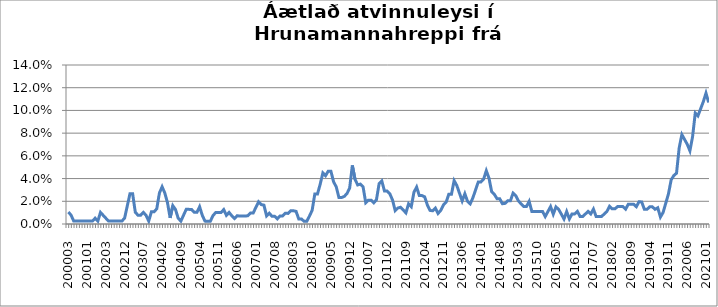
| Category | Series 0 |
|---|---|
| 200003 | 0.011 |
| 200004 | 0.008 |
| 200005 | 0.003 |
| 200007 | 0.003 |
| 200008 | 0.003 |
| 200011 | 0.003 |
| 200012 | 0.003 |
| 200101 | 0.003 |
| 200102 | 0.003 |
| 200103 | 0.003 |
| 200111 | 0.005 |
| 200112 | 0.003 |
| 200201 | 0.01 |
| 200202 | 0.008 |
| 200203 | 0.005 |
| 200204 | 0.003 |
| 200205 | 0.003 |
| 200206 | 0.003 |
| 200207 | 0.003 |
| 200208 | 0.003 |
| 200211 | 0.003 |
| 200212 | 0.005 |
| 200301 | 0.016 |
| 200302 | 0.027 |
| 200303 | 0.027 |
| 200304 | 0.01 |
| 200305 | 0.008 |
| 200306 | 0.008 |
| 200307 | 0.01 |
| 200308 | 0.008 |
| 200309 | 0.003 |
| 200310 | 0.011 |
| 200311 | 0.011 |
| 200312 | 0.013 |
| 200401 | 0.027 |
| 200402 | 0.033 |
| 200403 | 0.027 |
| 200404 | 0.019 |
| 200405 | 0.005 |
| 200406 | 0.016 |
| 200407 | 0.013 |
| 200408 | 0.005 |
| 200409 | 0.003 |
| 200410 | 0.008 |
| 200411 | 0.013 |
| 200412 | 0.013 |
| 200501 | 0.013 |
| 200502 | 0.01 |
| 200503 | 0.01 |
| 200504 | 0.015 |
| 200505 | 0.008 |
| 200506 | 0.003 |
| 200507 | 0.002 |
| 200508 | 0.002 |
| 200509 | 0.007 |
| 200510 | 0.01 |
| 200511 | 0.01 |
| 200512 | 0.01 |
| 200601 | 0.013 |
| 200602 | 0.008 |
| 200603 | 0.01 |
| 200604 | 0.007 |
| 200605 | 0.005 |
| 200606 | 0.007 |
| 200607 | 0.007 |
| 200608 | 0.007 |
| 200609 | 0.007 |
| 200610 | 0.007 |
| 200611 | 0.01 |
| 200612 | 0.01 |
| 200701 | 0.015 |
| 200702 | 0.02 |
| 200703 | 0.017 |
| 200704 | 0.017 |
| 200705 | 0.007 |
| 200706 | 0.009 |
| 200707 | 0.007 |
| 200708 | 0.007 |
| 200709 | 0.005 |
| 200710 | 0.007 |
| 200711 | 0.007 |
| 200712 | 0.009 |
| 200801 | 0.009 |
| 200802 | 0.012 |
| 200803 | 0.012 |
| 200804 | 0.011 |
| 200805 | 0.004 |
| 200806 | 0.004 |
| 200807 | 0.002 |
| 200808 | 0.002 |
| 200809 | 0.007 |
| 200810 | 0.012 |
| 200811 | 0.027 |
| 200812 | 0.027 |
| 200901 | 0.035 |
| 200902 | 0.045 |
| 200903 | 0.042 |
| 200904 | 0.047 |
| 200905 | 0.047 |
| 200906 | 0.037 |
| 200907 | 0.033 |
| 200908 | 0.023 |
| 200909 | 0.023 |
| 200910 | 0.024 |
| 200911 | 0.027 |
| 200912 | 0.032 |
| 201001 | 0.052 |
| 201002 | 0.039 |
| 201003 | 0.034 |
| 201004 | 0.035 |
| 201005 | 0.033 |
| 201006 | 0.019 |
| 201007 | 0.021 |
| 201008 | 0.021 |
| 201009 | 0.019 |
| 201010 | 0.021 |
| 201011 | 0.036 |
| 201012 | 0.038 |
| 201101 | 0.029 |
| 201102 | 0.029 |
| 201103 | 0.027 |
| 201104 | 0.021 |
| 201105 | 0.012 |
| 201106 | 0.014 |
| 201107 | 0.015 |
| 201108 | 0.012 |
| 201109 | 0.01 |
| 201110 | 0.018 |
| 201111 | 0.015 |
| 201112 | 0.028 |
| 201201 | 0.032 |
| 201202 | 0.025 |
| 201203 | 0.025 |
| 201204 | 0.024 |
| 201205 | 0.017 |
| 201206 | 0.012 |
| 201207 | 0.012 |
| 201208 | 0.014 |
| 201209 | 0.009 |
| 201210 | 0.012 |
| 201211 | 0.017 |
| 201212 | 0.019 |
| 201301 | 0.026 |
| 201302 | 0.026 |
| 201303 | 0.038 |
| 201304 | 0.034 |
| 201305 | 0.027 |
| 201306 | 0.02 |
| 201307 | 0.027 |
| 201308 | 0.02 |
| 201309 | 0.018 |
| 201310 | 0.023 |
| 201311 | 0.03 |
| 201312 | 0.037 |
| 201401 | 0.037 |
| 201402 | 0.04 |
| 201403 | 0.047 |
| 201404 | 0.04 |
| 201405 | 0.029 |
| 201406 | 0.026 |
| 201407 | 0.022 |
| 201408 | 0.022 |
| 201409 | 0.018 |
| 201410 | 0.018 |
| 201411 | 0.02 |
| 201412 | 0.02 |
| 201501 | 0.027 |
| 201502 | 0.025 |
| 201503 | 0.02 |
| 201504 | 0.018 |
| 201505 | 0.015 |
| 201506 | 0.015 |
| 201507 | 0.02 |
| 201508 | 0.011 |
| 201509 | 0.011 |
| 201510 | 0.011 |
| 201511 | 0.011 |
| 201512 | 0.011 |
| 201601 | 0.007 |
| 201602 | 0.011 |
| 201603 | 0.015 |
| 201604 | 0.009 |
| 201605 | 0.015 |
| 201606 | 0.013 |
| 201607 | 0.009 |
| 201608 | 0.004 |
| 201609 | 0.011 |
| 201610 | 0.004 |
| 201611 | 0.009 |
| 201612 | 0.009 |
| 201701 | 0.011 |
| 201702 | 0.007 |
| 201703 | 0.007 |
| 201704 | 0.009 |
| 201705 | 0.011 |
| 201706 | 0.009 |
| 201707 | 0.013 |
| 201708 | 0.007 |
| 201709 | 0.007 |
| 201710 | 0.007 |
| 201711 | 0.009 |
| 201712 | 0.011 |
| 201801 | 0.016 |
| 201802 | 0.013 |
| 201803 | 0.013 |
| 201804 | 0.015 |
| 201805 | 0.015 |
| 201806 | 0.015 |
| 201807 | 0.013 |
| 201808 | 0.017 |
| 201809 | 0.017 |
| 201810 | 0.017 |
| 201811 | 0.015 |
| 201812 | 0.02 |
| 201901 | 0.019 |
| 201902 | 0.013 |
| 201903 | 0.013 |
| 201904 | 0.015 |
| 201905 | 0.015 |
| 201906 | 0.013 |
| 201907 | 0.014 |
| 201908 | 0.006 |
| 201909 | 0.01 |
| 201910 | 0.018 |
| 201911 | 0.027 |
| 201912 | 0.039 |
| 202001 | 0.043 |
| 202002 | 0.045 |
| 202003 | 0.067 |
| 202004 | 0.079 |
| 202005 | 0.074 |
| 202006 | 0.07 |
| 202007 | 0.064 |
| 202008 | 0.077 |
| 202009 | 0.098 |
| 202010 | 0.095 |
| 202011 | 0.101 |
| 202012 | 0.108 |
| 202101 | 0.115 |
| 202102 | 0.107 |